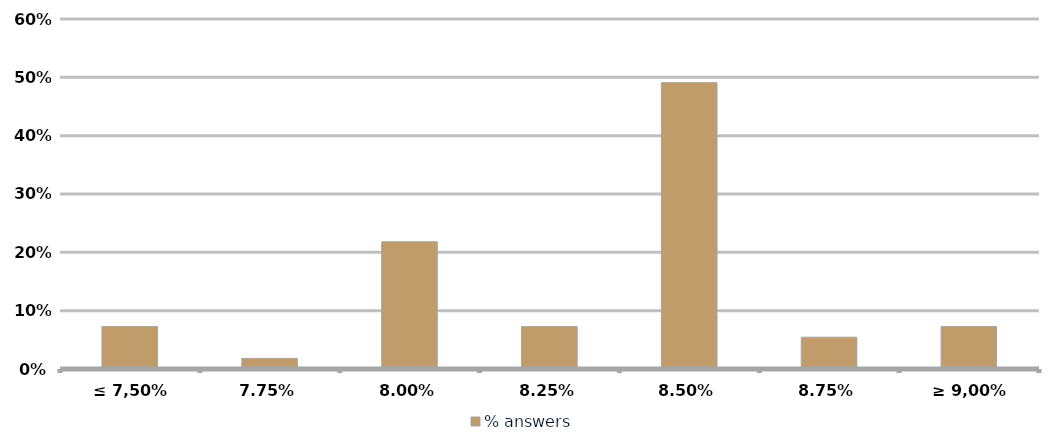
| Category | % answers |
|---|---|
| ≤ 7,50% | 0.073 |
| 7,75% | 0.018 |
| 8,00% | 0.218 |
| 8,25% | 0.073 |
| 8,50% | 0.491 |
| 8,75% | 0.055 |
| ≥ 9,00% | 0.073 |